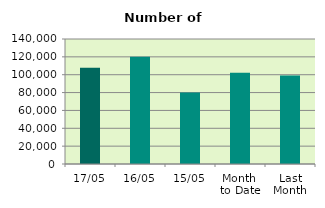
| Category | Series 0 |
|---|---|
| 17/05 | 107740 |
| 16/05 | 119982 |
| 15/05 | 80092 |
| Month 
to Date | 102064.167 |
| Last
Month | 99222.444 |